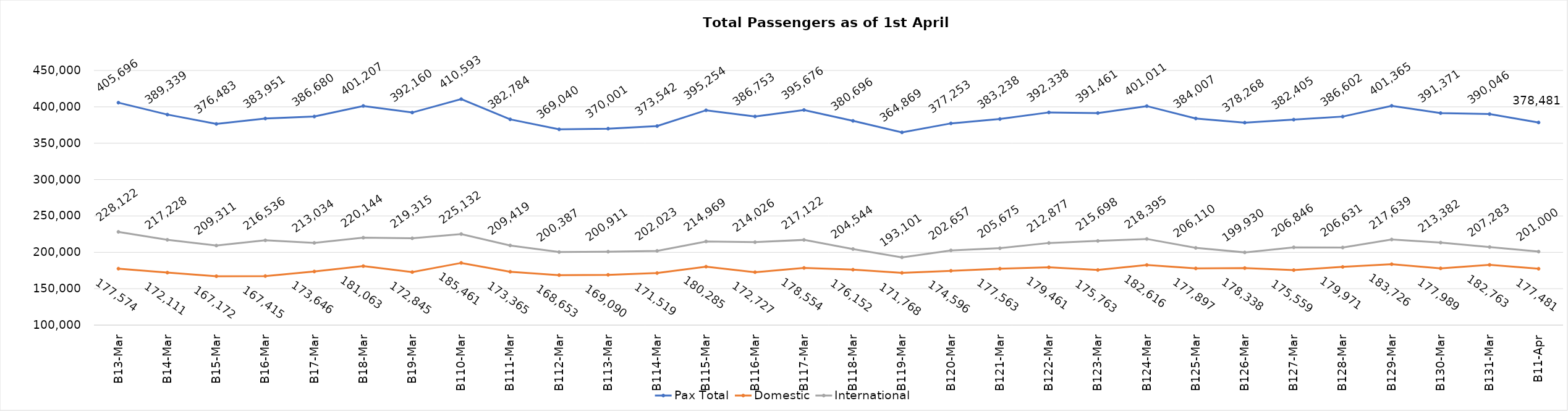
| Category | Pax Total | Domestic | International |
|---|---|---|---|
| 2024-03-03 | 405696 | 177574 | 228122 |
| 2024-03-04 | 389339 | 172111 | 217228 |
| 2024-03-05 | 376483 | 167172 | 209311 |
| 2024-03-06 | 383951 | 167415 | 216536 |
| 2024-03-07 | 386680 | 173646 | 213034 |
| 2024-03-08 | 401207 | 181063 | 220144 |
| 2024-03-09 | 392160 | 172845 | 219315 |
| 2024-03-10 | 410593 | 185461 | 225132 |
| 2024-03-11 | 382784 | 173365 | 209419 |
| 2024-03-12 | 369040 | 168653 | 200387 |
| 2024-03-13 | 370001 | 169090 | 200911 |
| 2024-03-14 | 373542 | 171519 | 202023 |
| 2024-03-15 | 395254 | 180285 | 214969 |
| 2024-03-16 | 386753 | 172727 | 214026 |
| 2024-03-17 | 395676 | 178554 | 217122 |
| 2024-03-18 | 380696 | 176152 | 204544 |
| 2024-03-19 | 364869 | 171768 | 193101 |
| 2024-03-20 | 377253 | 174596 | 202657 |
| 2024-03-21 | 383238 | 177563 | 205675 |
| 2024-03-22 | 392338 | 179461 | 212877 |
| 2024-03-23 | 391461 | 175763 | 215698 |
| 2024-03-24 | 401011 | 182616 | 218395 |
| 2024-03-25 | 384007 | 177897 | 206110 |
| 2024-03-26 | 378268 | 178338 | 199930 |
| 2024-03-27 | 382405 | 175559 | 206846 |
| 2024-03-28 | 386602 | 179971 | 206631 |
| 2024-03-29 | 401365 | 183726 | 217639 |
| 2024-03-30 | 391371 | 177989 | 213382 |
| 2024-03-31 | 390046 | 182763 | 207283 |
| 2024-04-01 | 378481 | 177481 | 201000 |